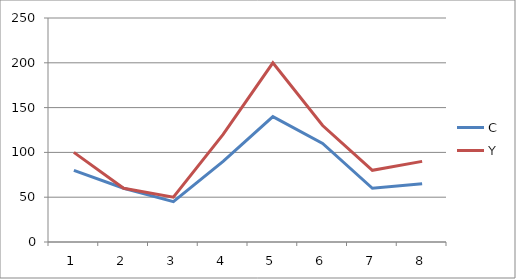
| Category | C | Y |
|---|---|---|
| 0 | 80 | 100 |
| 1 | 60 | 60 |
| 2 | 45 | 50 |
| 3 | 90 | 120 |
| 4 | 140 | 200 |
| 5 | 110 | 130 |
| 6 | 60 | 80 |
| 7 | 65 | 90 |